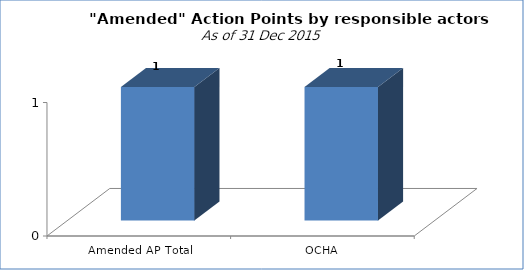
| Category | Count of Action |
|---|---|
| Amended AP Total | 1 |
| OCHA | 1 |